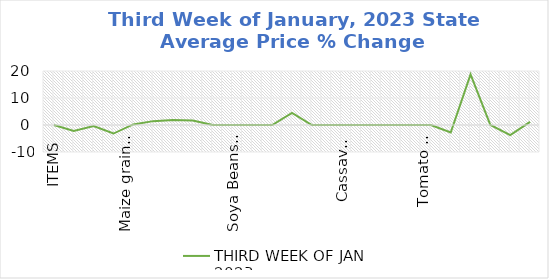
| Category | THIRD WEEK OF JAN 2023 |
|---|---|
| ITEMS | 0 |
| Rice, Imported, High Quality Sold loose  (1 mudu) | -2.172 |
| Rice, Agric Sold Loose(Low quality) imported  (1 mudu) | -0.356 |
| Rice Local, Sold Loose   (1 mudu) | -3.162 |
| Maize grain, white sold loose   (1 mudu) | 0.224 |
| Maize grain, yellow sold loose   (1 mudu) | 1.432 |
| Sorghum (Guinea Corn) white or brown, sold loose   (1 mudu) | 1.84 |
| millet (jero or maiwa) sold loose   (1 mudu) | 1.63 |
| Beans: white black eye. Sold loose   (1 mudu) | 0 |
| Beans Brown, sold loose  (1 mudu) | 0 |
| Soya Beans, sold loose    (1 mudu) | 0 |
| Gari White, sold loose  (1 mudu) | 0 |
| Gari Yellow, sold loose   (1 mudu) | 4.505 |
| Palm oil (1 schnap bottle) | 0 |
| Yam tuber (1 Medium Size) | 0 |
| Cassava tuber | 0 |
| Irish potato  (4 Litre rubber) | 0 |
| Sweet potato  (5 Medium Size) | 0 |
| Local live chicken  | 0 |
| Groundnut - shelled (fresh) | 0 |
| Tomato fresh   (4 Litre rubber) | -2.768 |
| Okro fresh     (1 mudu) | 18.75 |
| Okro dried    (1 mudu) | 0 |
| Onion   (4 Litre rubber) | -3.75 |
| Pepper fresh   (4 Litre rubber) | 1.156 |